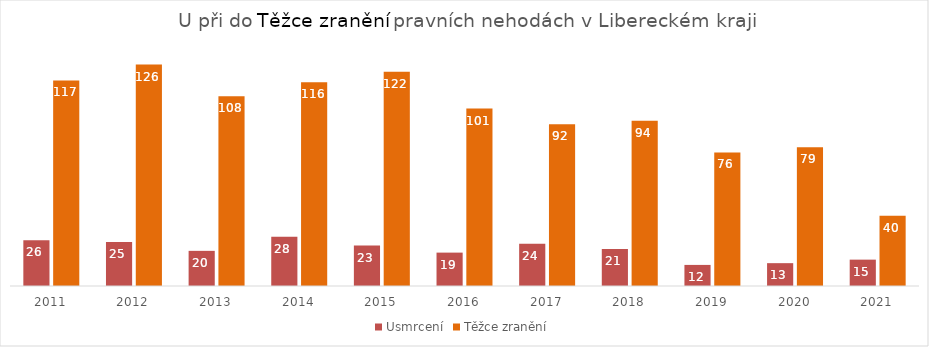
| Category | Usmrcení | Těžce zranění |
|---|---|---|
| 2011.0 | 26 | 117 |
| 2012.0 | 25 | 126 |
| 2013.0 | 20 | 108 |
| 2014.0 | 28 | 116 |
| 2015.0 | 23 | 122 |
| 2016.0 | 19 | 101 |
| 2017.0 | 24 | 92 |
| 2018.0 | 21 | 94 |
| 2019.0 | 12 | 76 |
| 2020.0 | 13 | 79 |
| 2021.0 | 15 | 40 |